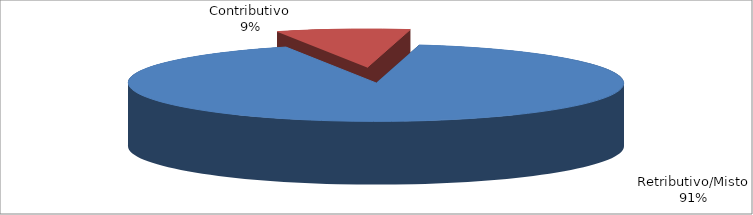
| Category | Decorrenti gennaio - settembre 2021 |
|---|---|
| Retributivo/Misto | 228703 |
| Contributivo | 21781 |